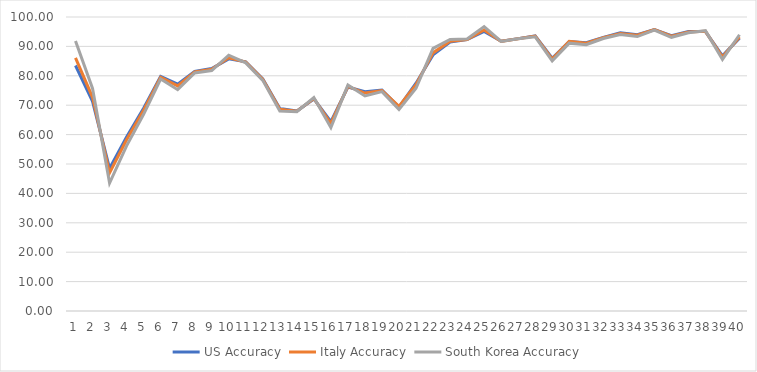
| Category | US Accuracy | Italy Accuracy | South Korea Accuracy |
|---|---|---|---|
| 0 | 83.51 | 86.08 | 91.81 |
| 1 | 71.34 | 72.69 | 75.68 |
| 2 | 48.48 | 46.94 | 43.52 |
| 3 | 59.15 | 58.23 | 56.18 |
| 4 | 68.95 | 68.32 | 66.91 |
| 5 | 79.79 | 79.52 | 78.92 |
| 6 | 77.16 | 76.58 | 75.29 |
| 7 | 81.5 | 81.32 | 80.94 |
| 8 | 82.49 | 82.27 | 81.8 |
| 9 | 85.77 | 86.15 | 87 |
| 10 | 84.74 | 84.64 | 84.41 |
| 11 | 78.93 | 78.78 | 78.45 |
| 12 | 68.86 | 68.6 | 68.02 |
| 13 | 68 | 67.93 | 67.79 |
| 14 | 72.13 | 72.27 | 72.6 |
| 15 | 64.41 | 63.78 | 62.37 |
| 16 | 76.19 | 76.39 | 76.85 |
| 17 | 74.58 | 74.13 | 73.15 |
| 18 | 75.14 | 74.98 | 74.62 |
| 19 | 69.36 | 69.59 | 68.58 |
| 20 | 77.48 | 77 | 75.77 |
| 21 | 87.11 | 87.79 | 89.32 |
| 22 | 91.49 | 91.76 | 92.37 |
| 23 | 92.29 | 92.36 | 92.53 |
| 24 | 95.09 | 95.6 | 96.72 |
| 25 | 91.74 | 91.72 | 91.69 |
| 26 | 92.65 | 92.63 | 92.58 |
| 27 | 93.59 | 93.49 | 93.26 |
| 28 | 85.98 | 85.7 | 85.07 |
| 29 | 91.64 | 91.74 | 91.1 |
| 30 | 91.27 | 91.06 | 90.57 |
| 31 | 93.08 | 92.96 | 92.69 |
| 32 | 94.6 | 94.42 | 94.01 |
| 33 | 93.99 | 93.79 | 93.34 |
| 34 | 95.75 | 95.68 | 95.53 |
| 35 | 93.65 | 93.48 | 93.09 |
| 36 | 95.06 | 94.93 | 94.65 |
| 37 | 95.03 | 95.13 | 95.34 |
| 38 | 86.77 | 86.4 | 85.58 |
| 39 | 92.82 | 93.17 | 93.96 |